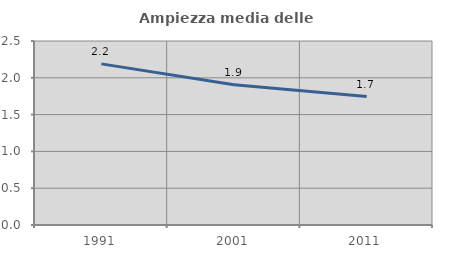
| Category | Ampiezza media delle famiglie |
|---|---|
| 1991.0 | 2.189 |
| 2001.0 | 1.905 |
| 2011.0 | 1.745 |